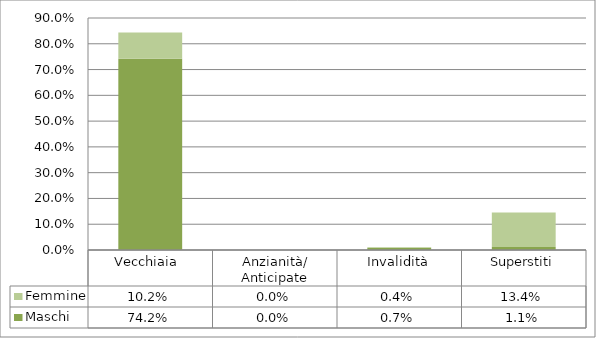
| Category | Maschi | Femmine |
|---|---|---|
| Vecchiaia  | 0.742 | 0.102 |
| Anzianità/ Anticipate | 0 | 0 |
| Invalidità | 0.007 | 0.004 |
| Superstiti | 0.011 | 0.134 |